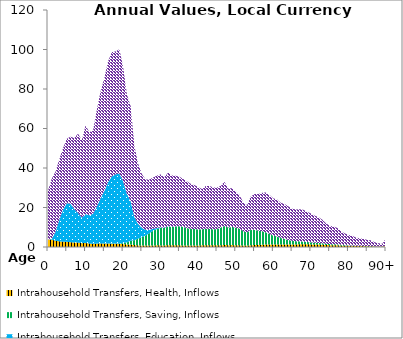
| Category | Intrahousehold Transfers, Health, Inflows | Intrahousehold Transfers, Saving, Inflows | Intrahousehold Transfers, Education, Inflows | Intrahousehold Transfers, Consumption other than health and education, Inflows |
|---|---|---|---|---|
| 0 | 3841.119 | 0 | 0 | 24711.773 |
|  | 3743.179 | 0 | 348.988 | 30508.992 |
| 2 | 3170.261 | 0 | 4515.681 | 30458.104 |
| 3 | 2864.428 | 0 | 10913.744 | 30622.307 |
| 4 | 2705.95 | 0 | 16241.956 | 31039.024 |
| 5 | 2611.953 | 0 | 19586.295 | 32638.77 |
| 6 | 2425.878 | 0 | 19460.85 | 33934.422 |
| 7 | 2260.521 | 0 | 16914.301 | 36000.155 |
| 8 | 2213.615 | 0 | 14999.571 | 40186.664 |
| 9 | 1933.207 | 0 | 12927.827 | 39148.671 |
| 10 | 2034.622 | 0 | 14621.607 | 44868.356 |
| 11 | 1753.08 | 0 | 14293.86 | 42109.045 |
| 12 | 1612.702 | 0.066 | 15182.916 | 42210.685 |
| 13 | 1706.849 | 0.482 | 18762.522 | 48989.784 |
| 14 | 1730.89 | 5.383 | 22861.807 | 54145.577 |
| 15 | 1702.718 | 27.174 | 26712.049 | 57106.887 |
| 16 | 1722.345 | 63.454 | 31045.17 | 61209.83 |
| 17 | 1689.907 | 88.248 | 33982.804 | 62891.538 |
| 18 | 1604.472 | 112.329 | 35065.547 | 62264.282 |
| 19 | 1567.696 | 203.74 | 35494.154 | 62833.02 |
| 20 | 1452.838 | 502.669 | 31301.779 | 57991.071 |
| 21 | 1291.846 | 1032.68 | 24583.465 | 50331.427 |
| 22 | 1268.198 | 1920.701 | 20002.481 | 48190.232 |
| 23 | 962.208 | 2479.388 | 11758.053 | 35889.05 |
| 24 | 822.039 | 3371.458 | 7445.093 | 30561.569 |
| 25 | 745.888 | 4244.897 | 4686.226 | 27238.074 |
| 26 | 729.614 | 5083.958 | 2895.807 | 25490.057 |
| 27 | 757.563 | 6194.024 | 1760.268 | 25458.978 |
| 28 | 796.388 | 7431.115 | 1003.701 | 26019.187 |
| 29 | 832.656 | 8245.781 | 506.279 | 26578.65 |
| 30 | 819.066 | 8836.508 | 274.678 | 26806.166 |
| 31 | 796.936 | 8841.204 | 179.302 | 25601.448 |
| 32 | 910.03 | 9409.01 | 107.272 | 27262.85 |
| 33 | 908.734 | 9289.905 | 50.686 | 26029.391 |
| 34 | 911.48 | 9526.66 | 35.176 | 25575.02 |
| 35 | 847.026 | 9622.614 | 40.072 | 25062.295 |
| 36 | 760.064 | 9455.924 | 37.781 | 24190.517 |
| 37 | 728.367 | 8851.366 | 19.497 | 23663.266 |
| 38 | 709.882 | 8481.065 | 3.58 | 22808.281 |
| 39 | 744.486 | 8364.28 | 1.351 | 22225.38 |
| 40 | 786.324 | 8186.807 | 12.146 | 21366.075 |
| 41 | 845.84 | 8115.535 | 24.865 | 20346.907 |
| 42 | 938.449 | 8342.988 | 27.228 | 21569.437 |
| 43 | 923.501 | 8279.121 | 22.818 | 21647.551 |
| 44 | 863.547 | 8106.274 | 9.528 | 21170.341 |
| 45 | 836.049 | 8270.821 | 1.475 | 21016.911 |
| 46 | 879.679 | 8942.016 | 0 | 21175.141 |
| 47 | 998.915 | 9630.478 | 0 | 22301.728 |
| 48 | 925.864 | 8900.634 | 0 | 19692.889 |
| 49 | 958.335 | 9196.567 | 0 | 19655.905 |
| 50 | 911.795 | 8901.743 | 0 | 18343.47 |
| 51 | 849.465 | 8468.088 | 0 | 17013.309 |
| 52 | 733.024 | 7251.573 | 0 | 14562.455 |
| 53 | 700.388 | 6733.479 | 0 | 13795.035 |
| 54 | 881.807 | 7814.012 | 0 | 16962.242 |
| 55 | 977.957 | 7711.301 | 0 | 18084.757 |
| 56 | 1036.609 | 7290.099 | 0.007 | 18462.806 |
| 57 | 1136.61 | 6882.497 | 0.034 | 19433.014 |
| 58 | 1233.777 | 6227.491 | 0.068 | 20122.542 |
| 59 | 1268.82 | 5338.309 | 0.085 | 19707.794 |
| 60 | 1269.223 | 4515.738 | 0.086 | 18835.053 |
| 61 | 1316.091 | 3969.014 | 0.085 | 18770.717 |
| 62 | 1291.321 | 3260.004 | 0.08 | 17824.906 |
| 63 | 1322.329 | 2739.985 | 0.14 | 17717.728 |
| 64 | 1309.302 | 2233.238 | 0.629 | 17037.953 |
| 65 | 1284.021 | 1864.248 | 1.643 | 16241.662 |
| 66 | 1305.138 | 1630.231 | 2.356 | 16057.382 |
| 67 | 1361.937 | 1480.199 | 2.902 | 16274.181 |
| 68 | 1384.932 | 1355.002 | 4.008 | 16107.374 |
| 69 | 1351.306 | 1167.017 | 5.368 | 15293.69 |
| 70 | 1316.282 | 1041.196 | 6.357 | 14656.881 |
| 71 | 1253.701 | 909.522 | 6.784 | 13722.242 |
| 72 | 1225.533 | 833.414 | 7.744 | 13108.435 |
| 73 | 1145.937 | 736.961 | 8.22 | 11976.399 |
| 74 | 1020.785 | 617.054 | 8.181 | 10400.613 |
| 75 | 931.129 | 529.23 | 8.253 | 9289.231 |
| 76 | 916.535 | 486.631 | 8.888 | 8950.629 |
| 77 | 874.791 | 434.698 | 9.228 | 8374.69 |
| 78 | 741.722 | 347.07 | 8.529 | 6973.359 |
| 79 | 646.478 | 286.911 | 8.121 | 5971.203 |
| 80 | 581.406 | 245.036 | 7.849 | 5270.72 |
| 81 | 554.287 | 210.155 | 7.391 | 4894.288 |
| 82 | 484.338 | 159.584 | 5.943 | 4121.818 |
| 83 | 461.004 | 132.006 | 5.239 | 3785.252 |
| 84 | 444.466 | 111.151 | 4.832 | 3533.35 |
| 85 | 402.449 | 86.322 | 4.171 | 3102.788 |
| 86 | 388.459 | 71.038 | 3.892 | 2914.818 |
| 87 | 282.043 | 43.441 | 2.744 | 2065.548 |
| 88 | 235.829 | 0 | 2.225 | 1689.203 |
| 89 | 193.858 | 0 | 1.765 | 1360.176 |
| 90+ | 564.413 | 0 | 4.901 | 3880.36 |